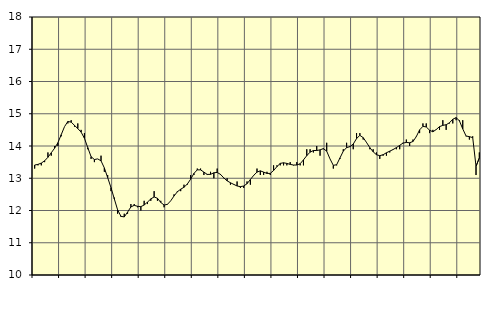
| Category | Piggar | Handel, SNI 45-47 |
|---|---|---|
| nan | 13.3 | 13.41 |
| 87.0 | 13.4 | 13.43 |
| 87.0 | 13.4 | 13.47 |
| 87.0 | 13.5 | 13.54 |
| nan | 13.8 | 13.65 |
| 88.0 | 13.7 | 13.79 |
| 88.0 | 14 | 13.93 |
| 88.0 | 14 | 14.1 |
| nan | 14.3 | 14.35 |
| 89.0 | 14.6 | 14.6 |
| 89.0 | 14.7 | 14.76 |
| 89.0 | 14.8 | 14.74 |
| nan | 14.6 | 14.64 |
| 90.0 | 14.7 | 14.54 |
| 90.0 | 14.5 | 14.43 |
| 90.0 | 14.4 | 14.24 |
| nan | 13.9 | 13.95 |
| 91.0 | 13.6 | 13.67 |
| 91.0 | 13.5 | 13.58 |
| 91.0 | 13.6 | 13.6 |
| nan | 13.7 | 13.54 |
| 92.0 | 13.2 | 13.32 |
| 92.0 | 13.1 | 13.02 |
| 92.0 | 12.6 | 12.71 |
| nan | 12.4 | 12.36 |
| 93.0 | 11.9 | 12.02 |
| 93.0 | 11.8 | 11.82 |
| 93.0 | 11.9 | 11.8 |
| nan | 11.9 | 11.95 |
| 94.0 | 12.2 | 12.11 |
| 94.0 | 12.2 | 12.16 |
| 94.0 | 12.1 | 12.13 |
| nan | 12 | 12.12 |
| 95.0 | 12.3 | 12.17 |
| 95.0 | 12.2 | 12.26 |
| 95.0 | 12.3 | 12.36 |
| nan | 12.6 | 12.42 |
| 96.0 | 12.3 | 12.38 |
| 96.0 | 12.3 | 12.25 |
| 96.0 | 12.1 | 12.17 |
| nan | 12.2 | 12.19 |
| 97.0 | 12.3 | 12.3 |
| 97.0 | 12.5 | 12.45 |
| 97.0 | 12.6 | 12.58 |
| nan | 12.6 | 12.66 |
| 98.0 | 12.8 | 12.72 |
| 98.0 | 12.8 | 12.82 |
| 98.0 | 13.1 | 12.97 |
| nan | 13.1 | 13.15 |
| 99.0 | 13.3 | 13.26 |
| 99.0 | 13.3 | 13.26 |
| 99.0 | 13.1 | 13.19 |
| nan | 13.1 | 13.12 |
| 0.0 | 13.2 | 13.12 |
| 0.0 | 13 | 13.17 |
| 0.0 | 13.3 | 13.18 |
| nan | 13.1 | 13.12 |
| 1.0 | 13 | 13.01 |
| 1.0 | 13 | 12.92 |
| 1.0 | 12.8 | 12.86 |
| nan | 12.8 | 12.81 |
| 2.0 | 12.9 | 12.76 |
| 2.0 | 12.7 | 12.74 |
| 2.0 | 12.7 | 12.76 |
| nan | 12.9 | 12.83 |
| 3.0 | 12.8 | 12.96 |
| 3.0 | 13.1 | 13.09 |
| 3.0 | 13.3 | 13.19 |
| nan | 13.1 | 13.23 |
| 4.0 | 13.1 | 13.19 |
| 4.0 | 13.2 | 13.15 |
| 4.0 | 13.1 | 13.15 |
| nan | 13.4 | 13.24 |
| 5.0 | 13.4 | 13.36 |
| 5.0 | 13.4 | 13.46 |
| 5.0 | 13.4 | 13.48 |
| nan | 13.4 | 13.46 |
| 6.0 | 13.5 | 13.43 |
| 6.0 | 13.4 | 13.41 |
| 6.0 | 13.5 | 13.41 |
| nan | 13.4 | 13.45 |
| 7.0 | 13.4 | 13.57 |
| 7.0 | 13.9 | 13.7 |
| 7.0 | 13.9 | 13.81 |
| nan | 13.8 | 13.86 |
| 8.0 | 14 | 13.86 |
| 8.0 | 13.7 | 13.88 |
| 8.0 | 13.9 | 13.92 |
| nan | 14.1 | 13.84 |
| 9.0 | 13.6 | 13.6 |
| 9.0 | 13.3 | 13.4 |
| 9.0 | 13.4 | 13.42 |
| nan | 13.6 | 13.63 |
| 10.0 | 13.9 | 13.84 |
| 10.0 | 14.1 | 13.95 |
| 10.0 | 14 | 13.98 |
| nan | 13.9 | 14.06 |
| 11.0 | 14.4 | 14.23 |
| 11.0 | 14.4 | 14.33 |
| 11.0 | 14.2 | 14.26 |
| nan | 14.1 | 14.11 |
| 12.0 | 13.9 | 13.95 |
| 12.0 | 13.9 | 13.82 |
| 12.0 | 13.8 | 13.73 |
| nan | 13.6 | 13.7 |
| 13.0 | 13.7 | 13.73 |
| 13.0 | 13.7 | 13.79 |
| 13.0 | 13.8 | 13.84 |
| nan | 13.9 | 13.89 |
| 14.0 | 13.9 | 13.95 |
| 14.0 | 13.9 | 14.02 |
| 14.0 | 14.1 | 14.09 |
| nan | 14.2 | 14.11 |
| 15.0 | 14 | 14.1 |
| 15.0 | 14.2 | 14.14 |
| 15.0 | 14.3 | 14.29 |
| nan | 14.4 | 14.5 |
| 16.0 | 14.7 | 14.61 |
| 16.0 | 14.7 | 14.59 |
| 16.0 | 14.4 | 14.49 |
| nan | 14.5 | 14.44 |
| 17.0 | 14.5 | 14.51 |
| 17.0 | 14.5 | 14.6 |
| 17.0 | 14.8 | 14.64 |
| nan | 14.5 | 14.66 |
| 18.0 | 14.7 | 14.72 |
| 18.0 | 14.7 | 14.83 |
| 18.0 | 14.8 | 14.88 |
| nan | 14.8 | 14.78 |
| 19.0 | 14.8 | 14.53 |
| 19.0 | 14.3 | 14.31 |
| 19.0 | 14.2 | 14.29 |
| nan | 14.3 | 14.26 |
| 20.0 | 13.1 | 13.37 |
| 20.0 | 13.8 | 13.63 |